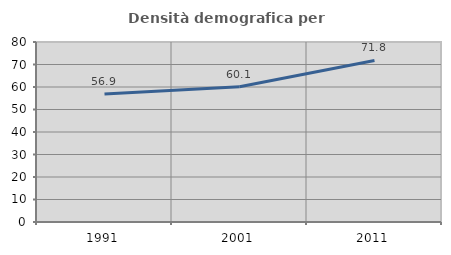
| Category | Densità demografica |
|---|---|
| 1991.0 | 56.93 |
| 2001.0 | 60.114 |
| 2011.0 | 71.786 |